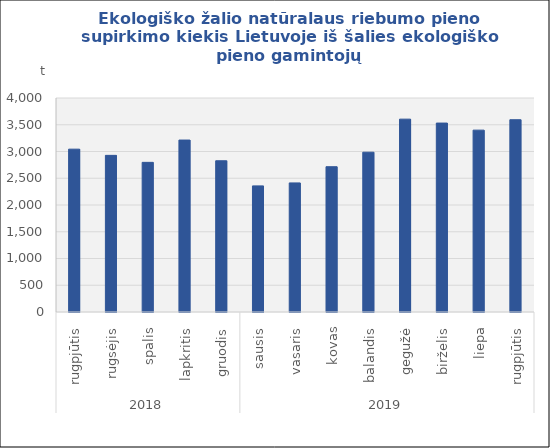
| Category | Ekologiško žalio natūralaus riebumo pieno supirkimo kiekis Lietuvoje iš šalies ekologiško pieno gamintojų |
|---|---|
| 0 | 3043.77 |
| 1 | 2927.63 |
| 2 | 2797.26 |
| 3 | 3213.87 |
| 4 | 2826.94 |
| 5 | 2357.31 |
| 6 | 2412.69 |
| 7 | 2715.7 |
| 8 | 2986.6 |
| 9 | 3604.56 |
| 10 | 3531.43 |
| 11 | 3399.389 |
| 12 | 3593.97 |